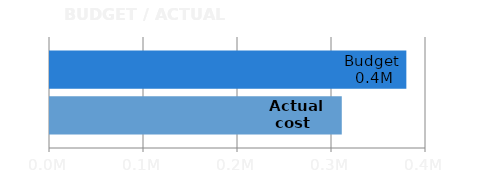
| Category | Actual cost  | Budget  |
|---|---|---|
| Total | 310400 | 379100 |